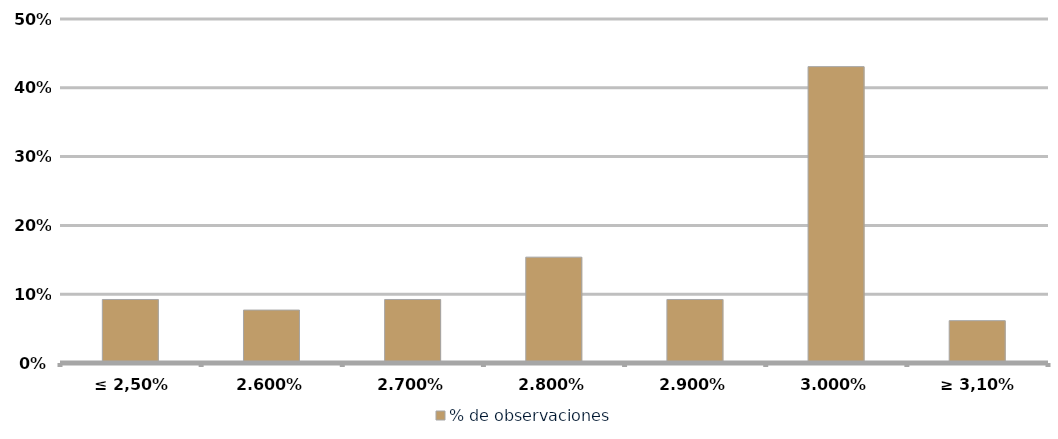
| Category | % de observaciones  |
|---|---|
| ≤ 2,50% | 0.092 |
| 2,60% | 0.077 |
| 2,70% | 0.092 |
| 2,80% | 0.154 |
| 2,90% | 0.092 |
| 3,00% | 0.431 |
| ≥ 3,10% | 0.062 |